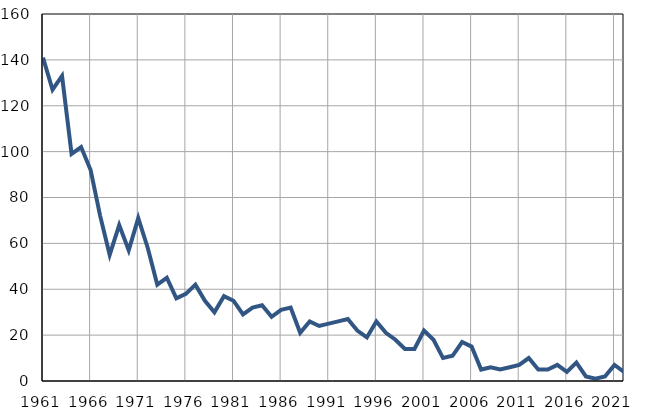
| Category | Infants
deaths |
|---|---|
| 1961.0 | 141 |
| 1962.0 | 127 |
| 1963.0 | 133 |
| 1964.0 | 99 |
| 1965.0 | 102 |
| 1966.0 | 92 |
| 1967.0 | 72 |
| 1968.0 | 55 |
| 1969.0 | 68 |
| 1970.0 | 57 |
| 1971.0 | 71 |
| 1972.0 | 58 |
| 1973.0 | 42 |
| 1974.0 | 45 |
| 1975.0 | 36 |
| 1976.0 | 38 |
| 1977.0 | 42 |
| 1978.0 | 35 |
| 1979.0 | 30 |
| 1980.0 | 37 |
| 1981.0 | 35 |
| 1982.0 | 29 |
| 1983.0 | 32 |
| 1984.0 | 33 |
| 1985.0 | 28 |
| 1986.0 | 31 |
| 1987.0 | 32 |
| 1988.0 | 21 |
| 1989.0 | 26 |
| 1990.0 | 24 |
| 1991.0 | 25 |
| 1992.0 | 26 |
| 1993.0 | 27 |
| 1994.0 | 22 |
| 1995.0 | 19 |
| 1996.0 | 26 |
| 1997.0 | 21 |
| 1998.0 | 18 |
| 1999.0 | 14 |
| 2000.0 | 14 |
| 2001.0 | 22 |
| 2002.0 | 18 |
| 2003.0 | 10 |
| 2004.0 | 11 |
| 2005.0 | 17 |
| 2006.0 | 15 |
| 2007.0 | 5 |
| 2008.0 | 6 |
| 2009.0 | 5 |
| 2010.0 | 6 |
| 2011.0 | 7 |
| 2012.0 | 10 |
| 2013.0 | 5 |
| 2014.0 | 5 |
| 2015.0 | 7 |
| 2016.0 | 4 |
| 2017.0 | 8 |
| 2018.0 | 2 |
| 2019.0 | 1 |
| 2020.0 | 2 |
| 2021.0 | 7 |
| 2022.0 | 4 |